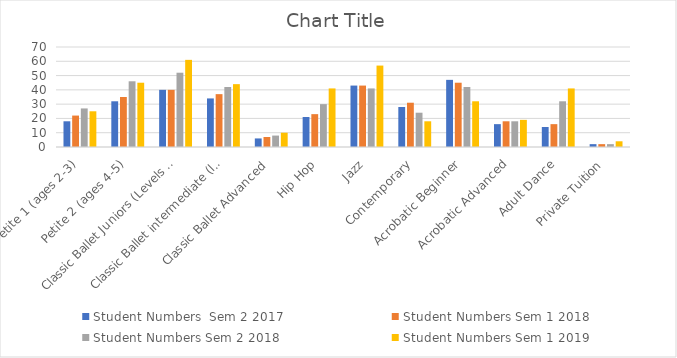
| Category | Student Numbers |
|---|---|
| Petite 1 (ages 2-3) | 25 |
| Petite 2 (ages 4-5) | 45 |
| Classic Ballet Juniors (Levels 1-3) | 61 |
| Classic Ballet intermediate (levels 4-5) | 44 |
| Classic Ballet Advanced | 10 |
| Hip Hop | 41 |
| Jazz | 57 |
| Contemporary | 18 |
| Acrobatic Beginner | 32 |
| Acrobatic Advanced | 19 |
| Adult Dance | 41 |
| Private Tuition | 4 |